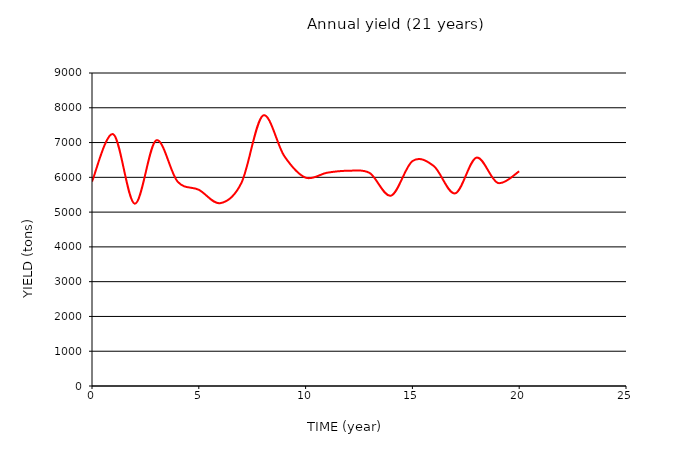
| Category | Yield t |
|---|---|
| 0.0 | 5878.943 |
| 1.0 | 7237.839 |
| 2.0 | 5241.958 |
| 3.0 | 7061.197 |
| 4.0 | 5882.142 |
| 5.0 | 5642.248 |
| 6.0 | 5256.855 |
| 7.0 | 5846.257 |
| 8.0 | 7774.482 |
| 9.0 | 6613.151 |
| 10.0 | 5991.473 |
| 11.0 | 6131.886 |
| 12.0 | 6188.728 |
| 13.0 | 6124.856 |
| 14.0 | 5473.023 |
| 15.0 | 6465.905 |
| 16.0 | 6325.37 |
| 17.0 | 5538.444 |
| 18.0 | 6565.618 |
| 19.0 | 5838.782 |
| 20.0 | 6174.408 |